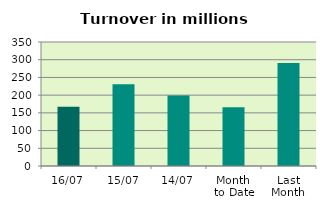
| Category | Series 0 |
|---|---|
| 16/07 | 167.138 |
| 15/07 | 230.554 |
| 14/07 | 198.648 |
| Month 
to Date | 166.051 |
| Last
Month | 290.981 |